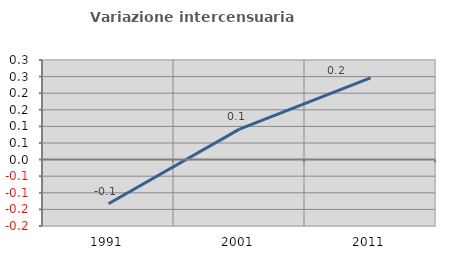
| Category | Variazione intercensuaria annua |
|---|---|
| 1991.0 | -0.133 |
| 2001.0 | 0.092 |
| 2011.0 | 0.246 |